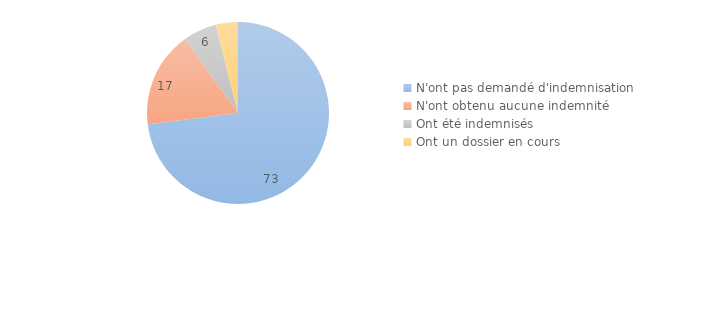
| Category | Series 0 |
|---|---|
| N'ont pas demandé d'indemnisation | 73 |
| N'ont obtenu aucune indemnité | 17.104 |
| Ont été indemnisés | 5.94 |
| Ont un dossier en cours | 3.923 |